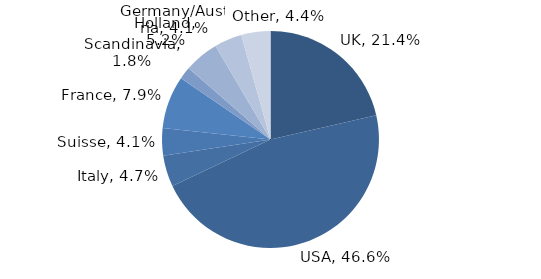
| Category | Investment Style |
|---|---|
| UK | 0.214 |
| USA | 0.466 |
| Italy | 0.047 |
| Suisse | 0.041 |
| France | 0.079 |
| Scandinavia | 0.018 |
| Holland | 0.052 |
| Germany/Austria | 0.041 |
| Other | 0.044 |